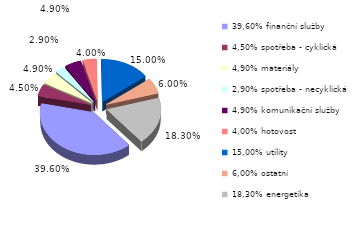
| Category | Series 0 |
|---|---|
| 39,60% finanční služby | 0.396 |
| 4,50% spotřeba - cyklická | 0.045 |
| 4,90% materiály | 0.049 |
| 2,90% spotřeba - necyklická | 0.029 |
| 4,90% komunikační služby | 0.049 |
| 4,00% hotovost | 0.04 |
| 15,00% utility | 0.15 |
| 6,00% ostatní | 0.06 |
| 18,30% energetika | 0.183 |